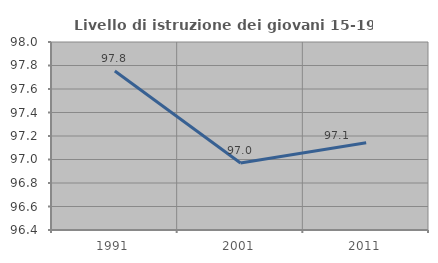
| Category | Livello di istruzione dei giovani 15-19 anni |
|---|---|
| 1991.0 | 97.753 |
| 2001.0 | 96.97 |
| 2011.0 | 97.143 |